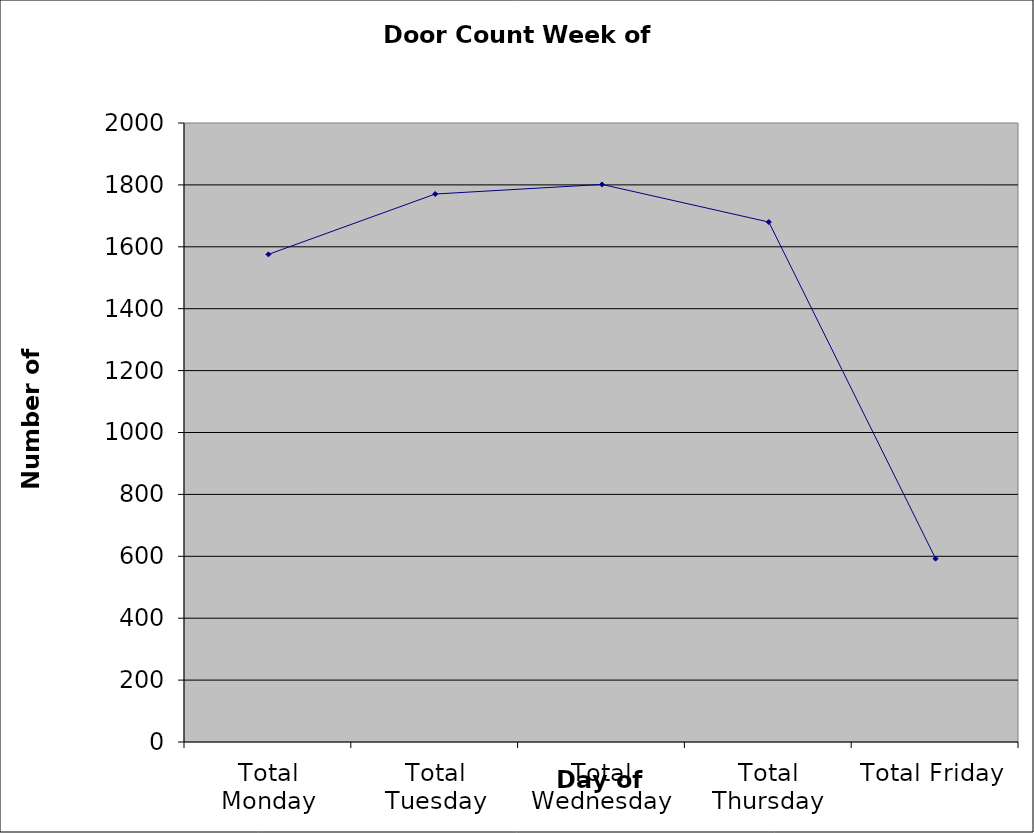
| Category | Series 0 |
|---|---|
| Total Monday | 1575.5 |
| Total Tuesday | 1770.5 |
| Total Wednesday | 1801.5 |
| Total Thursday | 1680 |
| Total Friday | 592.5 |